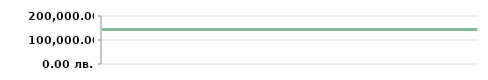
| Category | ГОДИНА   |
|---|---|
| 2013-04-23 | 143800 |
| 2013-04-25 | 143800 |
| 2013-05-07 | 143800 |
| 2013-05-14 | 143800 |
| 2013-05-14 | 143800 |
| 2013-05-29 | 143800 |
| 2013-06-10 | 143800 |
| 2013-06-21 | 143800 |
| 2013-07-06 | 143800 |
| 2013-08-05 | 143800 |
| 2013-08-19 | 143800 |
| 2013-09-04 | 143800 |
| 2013-09-20 | 143800 |
| 2013-09-25 | 143800 |
| 2013-10-15 | 143800 |
| 2013-11-05 | 143800 |
| 2013-11-26 | 143800 |
| 2013-11-30 | 143800 |
| 2013-12-11 | 143800 |